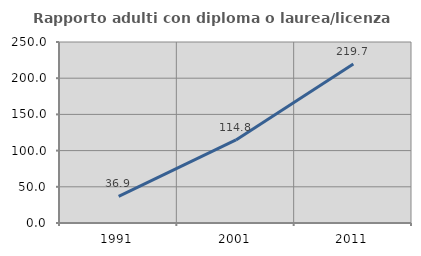
| Category | Rapporto adulti con diploma o laurea/licenza media  |
|---|---|
| 1991.0 | 36.865 |
| 2001.0 | 114.77 |
| 2011.0 | 219.683 |